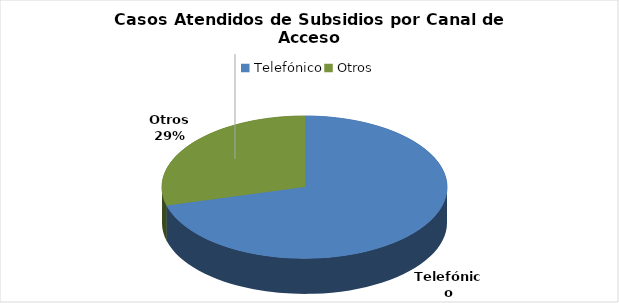
| Category | Total |
|---|---|
| Telefónico | 106921 |
| Otros | 44040 |